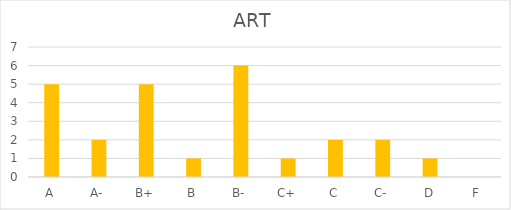
| Category | ART |
|---|---|
| A | 5 |
| A- | 2 |
| B+ | 5 |
| B | 1 |
| B- | 6 |
| C+ | 1 |
| C | 2 |
| C- | 2 |
| D | 1 |
| F | 0 |